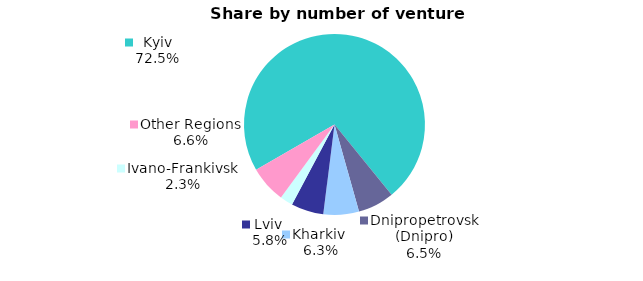
| Category | Series 0 |
|---|---|
| Kyiv | 0.725 |
| Dnipropetrovsk (Dnipro) | 0.065 |
| Kharkiv  | 0.063 |
| Lviv  | 0.058 |
| Ivano-Frankivsk | 0.023 |
| Other Regions | 0.066 |